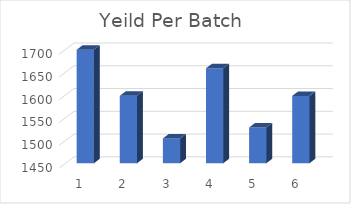
| Category | Series 0 |
|---|---|
| 0 | 1699.2 |
| 1 | 1598 |
| 2 | 1504.5 |
| 3 | 1658.5 |
| 4 | 1528.5 |
| 5 | 1597.74 |